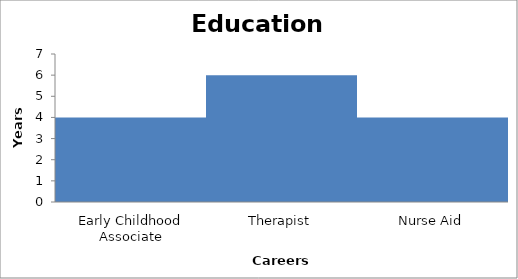
| Category | Series 0 |
|---|---|
| Early Childhood Associate | 4 |
| Therapist | 6 |
| Nurse Aid | 4 |